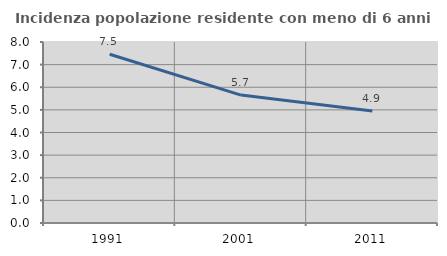
| Category | Incidenza popolazione residente con meno di 6 anni |
|---|---|
| 1991.0 | 7.458 |
| 2001.0 | 5.655 |
| 2011.0 | 4.948 |